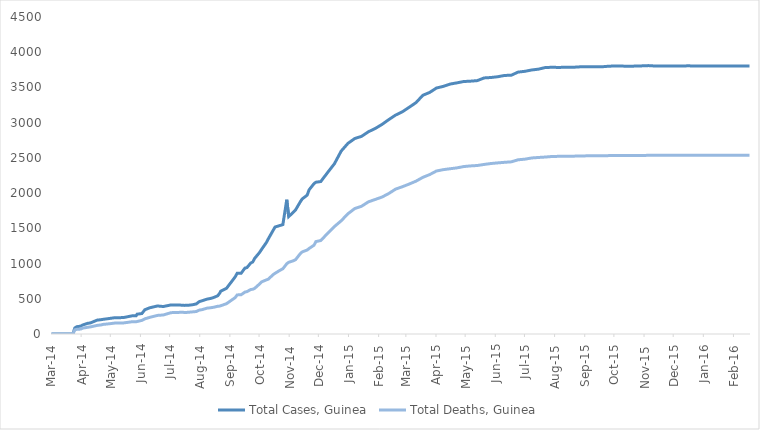
| Category | Total Cases, Guinea | Total Deaths, Guinea |
|---|---|---|
| 2014-03-01 | 0 | 0 |
| 2014-03-02 | 0 | 0 |
| 2014-03-03 | 0 | 0 |
| 2014-03-04 | 0 | 0 |
| 2014-03-05 | 0 | 0 |
| 2014-03-06 | 0 | 0 |
| 2014-03-07 | 0 | 0 |
| 2014-03-08 | 0 | 0 |
| 2014-03-09 | 0 | 0 |
| 2014-03-10 | 0 | 0 |
| 2014-03-11 | 0 | 0 |
| 2014-03-12 | 0 | 0 |
| 2014-03-13 | 0 | 0 |
| 2014-03-14 | 0 | 0 |
| 2014-03-15 | 0 | 0 |
| 2014-03-16 | 0 | 0 |
| 2014-03-17 | 0 | 0 |
| 2014-03-18 | 0 | 0 |
| 2014-03-19 | 0 | 0 |
| 2014-03-20 | 0 | 0 |
| 2014-03-21 | 0 | 0 |
| 2014-03-22 | 0 | 0 |
| 2014-03-23 | 0 | 0 |
| 2014-03-24 | 0 | 0 |
| 2014-03-25 | 86 | 59 |
| 2014-03-26 | 86 | 60 |
| 2014-03-27 | 103 | 66 |
| 2014-03-31 | 112 | 70 |
| 2014-04-01 | 122 | 80 |
| 2014-04-02 | 127 | 83 |
| 2014-04-07 | 151 | 95 |
| 2014-04-10 | 157 | 101 |
| 2014-04-17 | 197 | 122 |
| 2014-04-21 | 203 | 129 |
| 2014-04-23 | 208 | 136 |
| 2014-04-30 | 221 | 146 |
| 2014-05-05 | 231 | 155 |
| 2014-05-14 | 233 | 157 |
| 2014-05-23 | 258 | 174 |
| 2014-05-27 | 258 | 174 |
| 2014-05-28 | 281 | 186 |
| 2014-06-02 | 291 | 193 |
| 2014-06-05 | 344 | 215 |
| 2014-06-10 | 372 | 236 |
| 2014-06-11 | 376 | 241 |
| 2014-06-18 | 398 | 264 |
| 2014-06-24 | 390 | 270 |
| 2014-07-02 | 413 | 303 |
| 2014-07-07 | 412 | 305 |
| 2014-07-08 | 408 | 307 |
| 2014-07-14 | 409 | 309 |
| 2014-07-16 | 406 | 304 |
| 2014-07-21 | 410 | 310 |
| 2014-07-24 | 415 | 314 |
| 2014-07-28 | 427 | 319 |
| 2014-07-31 | 460 | 339 |
| 2014-08-03 | 472 | 346 |
| 2014-08-04 | 485 | 358 |
| 2014-08-08 | 495 | 367 |
| 2014-08-12 | 506 | 373 |
| 2014-08-13 | 510 | 377 |
| 2014-08-15 | 519 | 380 |
| 2014-08-19 | 543 | 394 |
| 2014-08-21 | 579 | 396 |
| 2014-08-22 | 607 | 406 |
| 2014-08-28 | 648 | 430 |
| 2014-09-06 | 812 | 517 |
| 2014-09-08 | 862 | 555 |
| 2014-09-12 | 861 | 557 |
| 2014-09-16 | 936 | 595 |
| 2014-09-18 | 942 | 601 |
| 2014-09-22 | 1008 | 632 |
| 2014-09-24 | 1022 | 635 |
| 2014-09-26 | 1074 | 648 |
| 2014-10-01 | 1157 | 710 |
| 2014-10-03 | 1199 | 739 |
| 2014-10-08 | 1298 | 768 |
| 2014-10-10 | 1350 | 778 |
| 2014-10-15 | 1472 | 843 |
| 2014-10-17 | 1519 | 862 |
| 2014-10-22 | 1540 | 904 |
| 2014-10-25 | 1553 | 926 |
| 2014-10-29 | 1906 | 997 |
| 2014-10-31 | 1667 | 1018 |
| 2014-11-05 | 1731 | 1041 |
| 2014-11-07 | 1760 | 1054 |
| 2014-11-12 | 1878 | 1142 |
| 2014-11-14 | 1919 | 1166 |
| 2014-11-19 | 1971 | 1192 |
| 2014-11-21 | 2047 | 1214 |
| 2014-11-26 | 2134 | 1260 |
| 2014-11-28 | 2155 | 1312 |
| 2014-12-03 | 2164 | 1327 |
| 2014-12-10 | 2292 | 1428 |
| 2014-12-17 | 2416 | 1525 |
| 2014-12-24 | 2597 | 1607 |
| 2014-12-31 | 2707 | 1708 |
| 2015-01-07 | 2775 | 1781 |
| 2015-01-14 | 2806 | 1814 |
| 2015-01-21 | 2871 | 1876 |
| 2015-01-28 | 2917 | 1910 |
| 2015-02-04 | 2975 | 1944 |
| 2015-02-11 | 3044 | 1995 |
| 2015-02-18 | 3108 | 2057 |
| 2015-02-25 | 3155 | 2091 |
| 2015-03-04 | 3219 | 2129 |
| 2015-03-11 | 3285 | 2170 |
| 2015-03-18 | 3389 | 2224 |
| 2015-03-25 | 3429 | 2263 |
| 2015-04-01 | 3492 | 2314 |
| 2015-04-08 | 3515 | 2333 |
| 2015-04-15 | 3548 | 2346 |
| 2015-04-22 | 3565 | 2358 |
| 2015-04-29 | 3584 | 2377 |
| 2015-05-06 | 3589 | 2386 |
| 2015-05-13 | 3597 | 2392 |
| 2015-05-20 | 3635 | 2407 |
| 2015-05-27 | 3641 | 2420 |
| 2015-06-03 | 3652 | 2429 |
| 2015-06-10 | 3670 | 2437 |
| 2015-06-17 | 3674 | 2444 |
| 2015-06-24 | 3718 | 2473 |
| 2015-07-01 | 3729 | 2482 |
| 2015-07-08 | 3748 | 2499 |
| 2015-07-15 | 3760 | 2506 |
| 2015-07-22 | 3783 | 2512 |
| 2015-07-29 | 3786 | 2520 |
| 2015-08-05 | 3784 | 2522 |
| 2015-08-12 | 3787 | 2524 |
| 2015-08-19 | 3786 | 2524 |
| 2015-08-26 | 3792 | 2527 |
| 2015-09-03 | 3792 | 2529 |
| 2015-09-10 | 3792 | 2530 |
| 2015-09-17 | 3792 | 2530 |
| 2015-09-24 | 3800 | 2532 |
| 2015-10-01 | 3805 | 2533 |
| 2015-10-08 | 3804 | 2534 |
| 2015-10-15 | 3800 | 2534 |
| 2015-10-22 | 3803 | 2535 |
| 2015-10-29 | 3806 | 2535 |
| 2015-11-05 | 3810 | 2536 |
| 2015-11-11 | 3805 | 2536 |
| 2015-11-18 | 3804 | 2536 |
| 2015-11-25 | 3804 | 2536 |
| 2015-12-02 | 3804 | 2536 |
| 2015-12-09 | 3804 | 2536 |
| 2015-12-16 | 3807 | 2536 |
| 2015-12-23 | 3804 | 2536 |
| 2015-12-30 | 3804 | 2536 |
| 2016-01-06 | 3804 | 2536 |
| 2016-01-13 | 3804 | 2536 |
| 2016-01-20 | 3804 | 2536 |
| 2016-01-27 | 3804 | 2536 |
| 2016-02-03 | 3804 | 2536 |
| 2016-02-10 | 3804 | 2536 |
| 2016-02-17 | 3804 | 2536 |